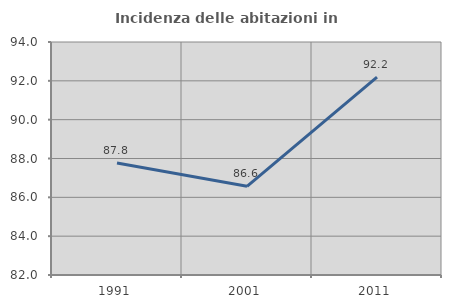
| Category | Incidenza delle abitazioni in proprietà  |
|---|---|
| 1991.0 | 87.77 |
| 2001.0 | 86.567 |
| 2011.0 | 92.188 |